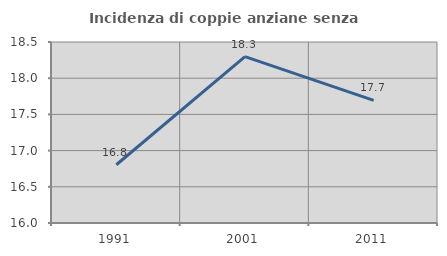
| Category | Incidenza di coppie anziane senza figli  |
|---|---|
| 1991.0 | 16.804 |
| 2001.0 | 18.299 |
| 2011.0 | 17.694 |